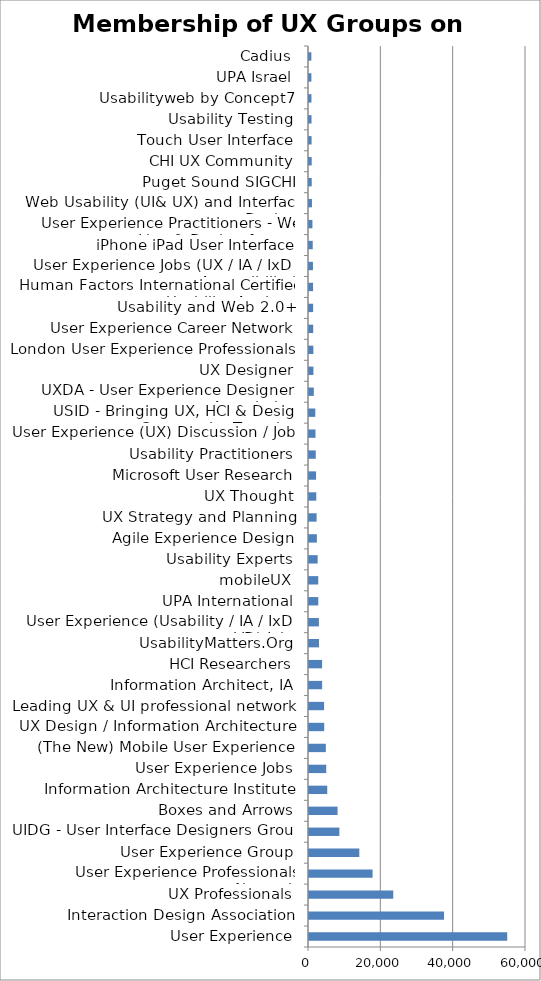
| Category | Membership |
|---|---|
| User Experience | 54806 |
| Interaction Design Association | 37340 |
| UX Professionals | 23301 |
| User Experience Professionals Network | 17583 |
| User Experience Group | 13910 |
| UIDG - User Interface Designers Group | 8400 |
| Boxes and Arrows | 7894 |
| Information Architecture Institute | 5044 |
| User Experience Jobs | 4764 |
| (The New) Mobile User Experience | 4651 |
| UX Design / Information Architecture | 4209 |
| Leading UX & UI professional network | 4176 |
| Information Architect, IA | 3632 |
| HCI Researchers | 3621 |
| UsabilityMatters.Org | 2776 |
| User Experience (Usability / IA / IxD / VD) Jobs | 2742 |
| UPA International | 2568 |
| mobileUX | 2555 |
| Usability Experts | 2395 |
| Agile Experience Design | 2170 |
| UX Strategy and Planning | 2107 |
| UX Thought | 2014 |
| Microsoft User Research | 1952 |
| Usability Practitioners | 1868 |
| User Experience (UX) Discussion / Jobs | 1799 |
| USID - Bringing UX, HCI & Design Community Together | 1741 |
| UXDA - User Experience Designers Association | 1328 |
| UX Designer | 1223 |
| London User Experience Professionals | 1195 |
| User Experience Career Network | 1163 |
| Usability and Web 2.0+ | 1150 |
| Human Factors International Certified Usability Analysts | 1121 |
| User Experience Jobs (UX / IA / IxD / Accessibility) | 1094 |
| iPhone iPad User Interface | 1031 |
| User Experience Practitioners - We Live & Design for you | 945 |
| Web Usability (UI& UX) and Interface Design | 812 |
| Puget Sound SIGCHI | 751 |
| CHI UX Community | 743 |
| Touch User Interface | 714 |
| Usability Testing | 695 |
| Usabilityweb by Concept7 | 676 |
| UPA Israel | 660 |
| Cadius | 651 |